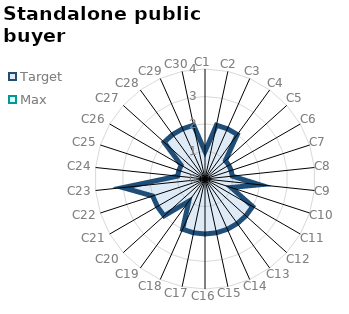
| Category | Target | Max |
|---|---|---|
| C1 | 1 | 0 |
| C2 | 2 | 0 |
| C3 | 2 | 0 |
| C4 | 2 | 0 |
| C5 | 1 | 0 |
| C6 | 1 | 0 |
| C7 | 1 | 0 |
| C8 | 1 | 0 |
| C9 | 2 | 0 |
| C10 | 1 | 0 |
| C11 | 2 | 0 |
| C12 | 2 | 0 |
| C13 | 2 | 0 |
| C14 | 2 | 0 |
| C15 | 2 | 0 |
| C16 | 2 | 0 |
| C17 | 2 | 0 |
| C18 | 2 | 0 |
| C19 | 1 | 0 |
| C20 | 2 | 0 |
| C21 | 2 | 0 |
| C22 | 2 | 0 |
| C23 | 3 | 0 |
| C24 | 1 | 0 |
| C25 | 1 | 0 |
| C26 | 1 | 0 |
| C27 | 2 | 0 |
| C28 | 2 | 0 |
| C29 | 2 | 0 |
| C30 | 2 | 0 |